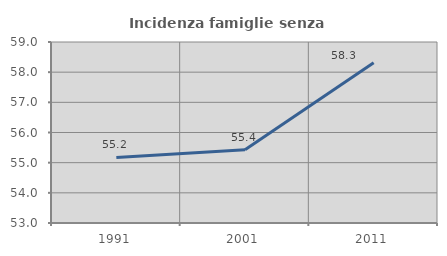
| Category | Incidenza famiglie senza nuclei |
|---|---|
| 1991.0 | 55.172 |
| 2001.0 | 55.432 |
| 2011.0 | 58.311 |